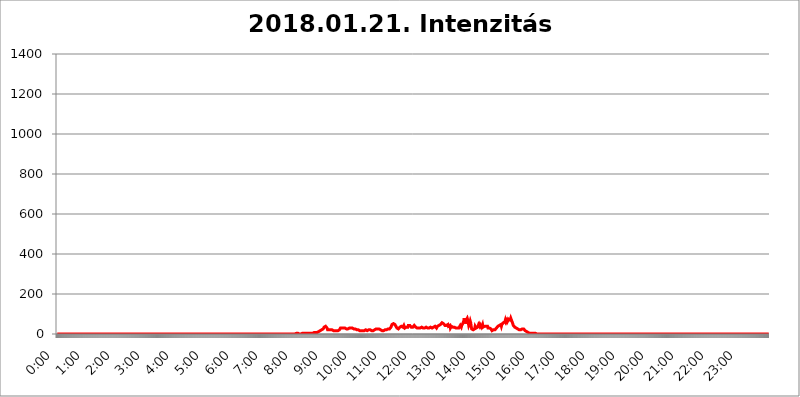
| Category | 2018.01.21. Intenzitás [W/m^2] |
|---|---|
| 0.0 | 0 |
| 0.0006944444444444445 | 0 |
| 0.001388888888888889 | 0 |
| 0.0020833333333333333 | 0 |
| 0.002777777777777778 | 0 |
| 0.003472222222222222 | 0 |
| 0.004166666666666667 | 0 |
| 0.004861111111111111 | 0 |
| 0.005555555555555556 | 0 |
| 0.0062499999999999995 | 0 |
| 0.006944444444444444 | 0 |
| 0.007638888888888889 | 0 |
| 0.008333333333333333 | 0 |
| 0.009027777777777779 | 0 |
| 0.009722222222222222 | 0 |
| 0.010416666666666666 | 0 |
| 0.011111111111111112 | 0 |
| 0.011805555555555555 | 0 |
| 0.012499999999999999 | 0 |
| 0.013194444444444444 | 0 |
| 0.013888888888888888 | 0 |
| 0.014583333333333332 | 0 |
| 0.015277777777777777 | 0 |
| 0.015972222222222224 | 0 |
| 0.016666666666666666 | 0 |
| 0.017361111111111112 | 0 |
| 0.018055555555555557 | 0 |
| 0.01875 | 0 |
| 0.019444444444444445 | 0 |
| 0.02013888888888889 | 0 |
| 0.020833333333333332 | 0 |
| 0.02152777777777778 | 0 |
| 0.022222222222222223 | 0 |
| 0.02291666666666667 | 0 |
| 0.02361111111111111 | 0 |
| 0.024305555555555556 | 0 |
| 0.024999999999999998 | 0 |
| 0.025694444444444447 | 0 |
| 0.02638888888888889 | 0 |
| 0.027083333333333334 | 0 |
| 0.027777777777777776 | 0 |
| 0.02847222222222222 | 0 |
| 0.029166666666666664 | 0 |
| 0.029861111111111113 | 0 |
| 0.030555555555555555 | 0 |
| 0.03125 | 0 |
| 0.03194444444444445 | 0 |
| 0.03263888888888889 | 0 |
| 0.03333333333333333 | 0 |
| 0.034027777777777775 | 0 |
| 0.034722222222222224 | 0 |
| 0.035416666666666666 | 0 |
| 0.036111111111111115 | 0 |
| 0.03680555555555556 | 0 |
| 0.0375 | 0 |
| 0.03819444444444444 | 0 |
| 0.03888888888888889 | 0 |
| 0.03958333333333333 | 0 |
| 0.04027777777777778 | 0 |
| 0.04097222222222222 | 0 |
| 0.041666666666666664 | 0 |
| 0.042361111111111106 | 0 |
| 0.04305555555555556 | 0 |
| 0.043750000000000004 | 0 |
| 0.044444444444444446 | 0 |
| 0.04513888888888889 | 0 |
| 0.04583333333333334 | 0 |
| 0.04652777777777778 | 0 |
| 0.04722222222222222 | 0 |
| 0.04791666666666666 | 0 |
| 0.04861111111111111 | 0 |
| 0.049305555555555554 | 0 |
| 0.049999999999999996 | 0 |
| 0.05069444444444445 | 0 |
| 0.051388888888888894 | 0 |
| 0.052083333333333336 | 0 |
| 0.05277777777777778 | 0 |
| 0.05347222222222222 | 0 |
| 0.05416666666666667 | 0 |
| 0.05486111111111111 | 0 |
| 0.05555555555555555 | 0 |
| 0.05625 | 0 |
| 0.05694444444444444 | 0 |
| 0.057638888888888885 | 0 |
| 0.05833333333333333 | 0 |
| 0.05902777777777778 | 0 |
| 0.059722222222222225 | 0 |
| 0.06041666666666667 | 0 |
| 0.061111111111111116 | 0 |
| 0.06180555555555556 | 0 |
| 0.0625 | 0 |
| 0.06319444444444444 | 0 |
| 0.06388888888888888 | 0 |
| 0.06458333333333334 | 0 |
| 0.06527777777777778 | 0 |
| 0.06597222222222222 | 0 |
| 0.06666666666666667 | 0 |
| 0.06736111111111111 | 0 |
| 0.06805555555555555 | 0 |
| 0.06874999999999999 | 0 |
| 0.06944444444444443 | 0 |
| 0.07013888888888889 | 0 |
| 0.07083333333333333 | 0 |
| 0.07152777777777779 | 0 |
| 0.07222222222222223 | 0 |
| 0.07291666666666667 | 0 |
| 0.07361111111111111 | 0 |
| 0.07430555555555556 | 0 |
| 0.075 | 0 |
| 0.07569444444444444 | 0 |
| 0.0763888888888889 | 0 |
| 0.07708333333333334 | 0 |
| 0.07777777777777778 | 0 |
| 0.07847222222222222 | 0 |
| 0.07916666666666666 | 0 |
| 0.0798611111111111 | 0 |
| 0.08055555555555556 | 0 |
| 0.08125 | 0 |
| 0.08194444444444444 | 0 |
| 0.08263888888888889 | 0 |
| 0.08333333333333333 | 0 |
| 0.08402777777777777 | 0 |
| 0.08472222222222221 | 0 |
| 0.08541666666666665 | 0 |
| 0.08611111111111112 | 0 |
| 0.08680555555555557 | 0 |
| 0.08750000000000001 | 0 |
| 0.08819444444444445 | 0 |
| 0.08888888888888889 | 0 |
| 0.08958333333333333 | 0 |
| 0.09027777777777778 | 0 |
| 0.09097222222222222 | 0 |
| 0.09166666666666667 | 0 |
| 0.09236111111111112 | 0 |
| 0.09305555555555556 | 0 |
| 0.09375 | 0 |
| 0.09444444444444444 | 0 |
| 0.09513888888888888 | 0 |
| 0.09583333333333333 | 0 |
| 0.09652777777777777 | 0 |
| 0.09722222222222222 | 0 |
| 0.09791666666666667 | 0 |
| 0.09861111111111111 | 0 |
| 0.09930555555555555 | 0 |
| 0.09999999999999999 | 0 |
| 0.10069444444444443 | 0 |
| 0.1013888888888889 | 0 |
| 0.10208333333333335 | 0 |
| 0.10277777777777779 | 0 |
| 0.10347222222222223 | 0 |
| 0.10416666666666667 | 0 |
| 0.10486111111111111 | 0 |
| 0.10555555555555556 | 0 |
| 0.10625 | 0 |
| 0.10694444444444444 | 0 |
| 0.1076388888888889 | 0 |
| 0.10833333333333334 | 0 |
| 0.10902777777777778 | 0 |
| 0.10972222222222222 | 0 |
| 0.1111111111111111 | 0 |
| 0.11180555555555556 | 0 |
| 0.11180555555555556 | 0 |
| 0.1125 | 0 |
| 0.11319444444444444 | 0 |
| 0.11388888888888889 | 0 |
| 0.11458333333333333 | 0 |
| 0.11527777777777777 | 0 |
| 0.11597222222222221 | 0 |
| 0.11666666666666665 | 0 |
| 0.1173611111111111 | 0 |
| 0.11805555555555557 | 0 |
| 0.11944444444444445 | 0 |
| 0.12013888888888889 | 0 |
| 0.12083333333333333 | 0 |
| 0.12152777777777778 | 0 |
| 0.12222222222222223 | 0 |
| 0.12291666666666667 | 0 |
| 0.12291666666666667 | 0 |
| 0.12361111111111112 | 0 |
| 0.12430555555555556 | 0 |
| 0.125 | 0 |
| 0.12569444444444444 | 0 |
| 0.12638888888888888 | 0 |
| 0.12708333333333333 | 0 |
| 0.16875 | 0 |
| 0.12847222222222224 | 0 |
| 0.12916666666666668 | 0 |
| 0.12986111111111112 | 0 |
| 0.13055555555555556 | 0 |
| 0.13125 | 0 |
| 0.13194444444444445 | 0 |
| 0.1326388888888889 | 0 |
| 0.13333333333333333 | 0 |
| 0.13402777777777777 | 0 |
| 0.13402777777777777 | 0 |
| 0.13472222222222222 | 0 |
| 0.13541666666666666 | 0 |
| 0.1361111111111111 | 0 |
| 0.13749999999999998 | 0 |
| 0.13819444444444443 | 0 |
| 0.1388888888888889 | 0 |
| 0.13958333333333334 | 0 |
| 0.14027777777777778 | 0 |
| 0.14097222222222222 | 0 |
| 0.14166666666666666 | 0 |
| 0.1423611111111111 | 0 |
| 0.14305555555555557 | 0 |
| 0.14375000000000002 | 0 |
| 0.14444444444444446 | 0 |
| 0.1451388888888889 | 0 |
| 0.1451388888888889 | 0 |
| 0.14652777777777778 | 0 |
| 0.14722222222222223 | 0 |
| 0.14791666666666667 | 0 |
| 0.1486111111111111 | 0 |
| 0.14930555555555555 | 0 |
| 0.15 | 0 |
| 0.15069444444444444 | 0 |
| 0.15138888888888888 | 0 |
| 0.15208333333333332 | 0 |
| 0.15277777777777776 | 0 |
| 0.15347222222222223 | 0 |
| 0.15416666666666667 | 0 |
| 0.15486111111111112 | 0 |
| 0.15555555555555556 | 0 |
| 0.15625 | 0 |
| 0.15694444444444444 | 0 |
| 0.15763888888888888 | 0 |
| 0.15833333333333333 | 0 |
| 0.15902777777777777 | 0 |
| 0.15972222222222224 | 0 |
| 0.16041666666666668 | 0 |
| 0.16111111111111112 | 0 |
| 0.16180555555555556 | 0 |
| 0.1625 | 0 |
| 0.16319444444444445 | 0 |
| 0.1638888888888889 | 0 |
| 0.16458333333333333 | 0 |
| 0.16527777777777777 | 0 |
| 0.16597222222222222 | 0 |
| 0.16666666666666666 | 0 |
| 0.1673611111111111 | 0 |
| 0.16805555555555554 | 0 |
| 0.16874999999999998 | 0 |
| 0.16944444444444443 | 0 |
| 0.17013888888888887 | 0 |
| 0.1708333333333333 | 0 |
| 0.17152777777777775 | 0 |
| 0.17222222222222225 | 0 |
| 0.1729166666666667 | 0 |
| 0.17361111111111113 | 0 |
| 0.17430555555555557 | 0 |
| 0.17500000000000002 | 0 |
| 0.17569444444444446 | 0 |
| 0.1763888888888889 | 0 |
| 0.17708333333333334 | 0 |
| 0.17777777777777778 | 0 |
| 0.17847222222222223 | 0 |
| 0.17916666666666667 | 0 |
| 0.1798611111111111 | 0 |
| 0.18055555555555555 | 0 |
| 0.18125 | 0 |
| 0.18194444444444444 | 0 |
| 0.1826388888888889 | 0 |
| 0.18333333333333335 | 0 |
| 0.1840277777777778 | 0 |
| 0.18472222222222223 | 0 |
| 0.18541666666666667 | 0 |
| 0.18611111111111112 | 0 |
| 0.18680555555555556 | 0 |
| 0.1875 | 0 |
| 0.18819444444444444 | 0 |
| 0.18888888888888888 | 0 |
| 0.18958333333333333 | 0 |
| 0.19027777777777777 | 0 |
| 0.1909722222222222 | 0 |
| 0.19166666666666665 | 0 |
| 0.19236111111111112 | 0 |
| 0.19305555555555554 | 0 |
| 0.19375 | 0 |
| 0.19444444444444445 | 0 |
| 0.1951388888888889 | 0 |
| 0.19583333333333333 | 0 |
| 0.19652777777777777 | 0 |
| 0.19722222222222222 | 0 |
| 0.19791666666666666 | 0 |
| 0.1986111111111111 | 0 |
| 0.19930555555555554 | 0 |
| 0.19999999999999998 | 0 |
| 0.20069444444444443 | 0 |
| 0.20138888888888887 | 0 |
| 0.2020833333333333 | 0 |
| 0.2027777777777778 | 0 |
| 0.2034722222222222 | 0 |
| 0.2041666666666667 | 0 |
| 0.20486111111111113 | 0 |
| 0.20555555555555557 | 0 |
| 0.20625000000000002 | 0 |
| 0.20694444444444446 | 0 |
| 0.2076388888888889 | 0 |
| 0.20833333333333334 | 0 |
| 0.20902777777777778 | 0 |
| 0.20972222222222223 | 0 |
| 0.21041666666666667 | 0 |
| 0.2111111111111111 | 0 |
| 0.21180555555555555 | 0 |
| 0.2125 | 0 |
| 0.21319444444444444 | 0 |
| 0.2138888888888889 | 0 |
| 0.21458333333333335 | 0 |
| 0.2152777777777778 | 0 |
| 0.21597222222222223 | 0 |
| 0.21666666666666667 | 0 |
| 0.21736111111111112 | 0 |
| 0.21805555555555556 | 0 |
| 0.21875 | 0 |
| 0.21944444444444444 | 0 |
| 0.22013888888888888 | 0 |
| 0.22083333333333333 | 0 |
| 0.22152777777777777 | 0 |
| 0.2222222222222222 | 0 |
| 0.22291666666666665 | 0 |
| 0.2236111111111111 | 0 |
| 0.22430555555555556 | 0 |
| 0.225 | 0 |
| 0.22569444444444445 | 0 |
| 0.2263888888888889 | 0 |
| 0.22708333333333333 | 0 |
| 0.22777777777777777 | 0 |
| 0.22847222222222222 | 0 |
| 0.22916666666666666 | 0 |
| 0.2298611111111111 | 0 |
| 0.23055555555555554 | 0 |
| 0.23124999999999998 | 0 |
| 0.23194444444444443 | 0 |
| 0.23263888888888887 | 0 |
| 0.2333333333333333 | 0 |
| 0.2340277777777778 | 0 |
| 0.2347222222222222 | 0 |
| 0.2354166666666667 | 0 |
| 0.23611111111111113 | 0 |
| 0.23680555555555557 | 0 |
| 0.23750000000000002 | 0 |
| 0.23819444444444446 | 0 |
| 0.2388888888888889 | 0 |
| 0.23958333333333334 | 0 |
| 0.24027777777777778 | 0 |
| 0.24097222222222223 | 0 |
| 0.24166666666666667 | 0 |
| 0.2423611111111111 | 0 |
| 0.24305555555555555 | 0 |
| 0.24375 | 0 |
| 0.24444444444444446 | 0 |
| 0.24513888888888888 | 0 |
| 0.24583333333333335 | 0 |
| 0.2465277777777778 | 0 |
| 0.24722222222222223 | 0 |
| 0.24791666666666667 | 0 |
| 0.24861111111111112 | 0 |
| 0.24930555555555556 | 0 |
| 0.25 | 0 |
| 0.25069444444444444 | 0 |
| 0.2513888888888889 | 0 |
| 0.2520833333333333 | 0 |
| 0.25277777777777777 | 0 |
| 0.2534722222222222 | 0 |
| 0.25416666666666665 | 0 |
| 0.2548611111111111 | 0 |
| 0.2555555555555556 | 0 |
| 0.25625000000000003 | 0 |
| 0.2569444444444445 | 0 |
| 0.2576388888888889 | 0 |
| 0.25833333333333336 | 0 |
| 0.2590277777777778 | 0 |
| 0.25972222222222224 | 0 |
| 0.2604166666666667 | 0 |
| 0.2611111111111111 | 0 |
| 0.26180555555555557 | 0 |
| 0.2625 | 0 |
| 0.26319444444444445 | 0 |
| 0.2638888888888889 | 0 |
| 0.26458333333333334 | 0 |
| 0.2652777777777778 | 0 |
| 0.2659722222222222 | 0 |
| 0.26666666666666666 | 0 |
| 0.2673611111111111 | 0 |
| 0.26805555555555555 | 0 |
| 0.26875 | 0 |
| 0.26944444444444443 | 0 |
| 0.2701388888888889 | 0 |
| 0.2708333333333333 | 0 |
| 0.27152777777777776 | 0 |
| 0.2722222222222222 | 0 |
| 0.27291666666666664 | 0 |
| 0.2736111111111111 | 0 |
| 0.2743055555555555 | 0 |
| 0.27499999999999997 | 0 |
| 0.27569444444444446 | 0 |
| 0.27638888888888885 | 0 |
| 0.27708333333333335 | 0 |
| 0.2777777777777778 | 0 |
| 0.27847222222222223 | 0 |
| 0.2791666666666667 | 0 |
| 0.2798611111111111 | 0 |
| 0.28055555555555556 | 0 |
| 0.28125 | 0 |
| 0.28194444444444444 | 0 |
| 0.2826388888888889 | 0 |
| 0.2833333333333333 | 0 |
| 0.28402777777777777 | 0 |
| 0.2847222222222222 | 0 |
| 0.28541666666666665 | 0 |
| 0.28611111111111115 | 0 |
| 0.28680555555555554 | 0 |
| 0.28750000000000003 | 0 |
| 0.2881944444444445 | 0 |
| 0.2888888888888889 | 0 |
| 0.28958333333333336 | 0 |
| 0.2902777777777778 | 0 |
| 0.29097222222222224 | 0 |
| 0.2916666666666667 | 0 |
| 0.2923611111111111 | 0 |
| 0.29305555555555557 | 0 |
| 0.29375 | 0 |
| 0.29444444444444445 | 0 |
| 0.2951388888888889 | 0 |
| 0.29583333333333334 | 0 |
| 0.2965277777777778 | 0 |
| 0.2972222222222222 | 0 |
| 0.29791666666666666 | 0 |
| 0.2986111111111111 | 0 |
| 0.29930555555555555 | 0 |
| 0.3 | 0 |
| 0.30069444444444443 | 0 |
| 0.3013888888888889 | 0 |
| 0.3020833333333333 | 0 |
| 0.30277777777777776 | 0 |
| 0.3034722222222222 | 0 |
| 0.30416666666666664 | 0 |
| 0.3048611111111111 | 0 |
| 0.3055555555555555 | 0 |
| 0.30624999999999997 | 0 |
| 0.3069444444444444 | 0 |
| 0.3076388888888889 | 0 |
| 0.30833333333333335 | 0 |
| 0.3090277777777778 | 0 |
| 0.30972222222222223 | 0 |
| 0.3104166666666667 | 0 |
| 0.3111111111111111 | 0 |
| 0.31180555555555556 | 0 |
| 0.3125 | 0 |
| 0.31319444444444444 | 0 |
| 0.3138888888888889 | 0 |
| 0.3145833333333333 | 0 |
| 0.31527777777777777 | 0 |
| 0.3159722222222222 | 0 |
| 0.31666666666666665 | 0 |
| 0.31736111111111115 | 0 |
| 0.31805555555555554 | 0 |
| 0.31875000000000003 | 0 |
| 0.3194444444444445 | 0 |
| 0.3201388888888889 | 0 |
| 0.32083333333333336 | 0 |
| 0.3215277777777778 | 0 |
| 0.32222222222222224 | 0 |
| 0.3229166666666667 | 0 |
| 0.3236111111111111 | 0 |
| 0.32430555555555557 | 0 |
| 0.325 | 0 |
| 0.32569444444444445 | 0 |
| 0.3263888888888889 | 0 |
| 0.32708333333333334 | 0 |
| 0.3277777777777778 | 0 |
| 0.3284722222222222 | 0 |
| 0.32916666666666666 | 0 |
| 0.3298611111111111 | 0 |
| 0.33055555555555555 | 0 |
| 0.33125 | 0 |
| 0.33194444444444443 | 0 |
| 0.3326388888888889 | 3.525 |
| 0.3333333333333333 | 0 |
| 0.3340277777777778 | 0 |
| 0.3347222222222222 | 0 |
| 0.3354166666666667 | 3.525 |
| 0.3361111111111111 | 3.525 |
| 0.3368055555555556 | 3.525 |
| 0.33749999999999997 | 3.525 |
| 0.33819444444444446 | 3.525 |
| 0.33888888888888885 | 3.525 |
| 0.33958333333333335 | 0 |
| 0.34027777777777773 | 3.525 |
| 0.34097222222222223 | 3.525 |
| 0.3416666666666666 | 0 |
| 0.3423611111111111 | 3.525 |
| 0.3430555555555555 | 3.525 |
| 0.34375 | 3.525 |
| 0.3444444444444445 | 3.525 |
| 0.3451388888888889 | 3.525 |
| 0.3458333333333334 | 3.525 |
| 0.34652777777777777 | 3.525 |
| 0.34722222222222227 | 3.525 |
| 0.34791666666666665 | 3.525 |
| 0.34861111111111115 | 3.525 |
| 0.34930555555555554 | 3.525 |
| 0.35000000000000003 | 3.525 |
| 0.3506944444444444 | 3.525 |
| 0.3513888888888889 | 3.525 |
| 0.3520833333333333 | 3.525 |
| 0.3527777777777778 | 3.525 |
| 0.3534722222222222 | 3.525 |
| 0.3541666666666667 | 3.525 |
| 0.3548611111111111 | 3.525 |
| 0.35555555555555557 | 3.525 |
| 0.35625 | 3.525 |
| 0.35694444444444445 | 3.525 |
| 0.3576388888888889 | 3.525 |
| 0.35833333333333334 | 3.525 |
| 0.3590277777777778 | 3.525 |
| 0.3597222222222222 | 3.525 |
| 0.36041666666666666 | 7.887 |
| 0.3611111111111111 | 3.525 |
| 0.36180555555555555 | 3.525 |
| 0.3625 | 7.887 |
| 0.36319444444444443 | 7.887 |
| 0.3638888888888889 | 7.887 |
| 0.3645833333333333 | 7.887 |
| 0.3652777777777778 | 7.887 |
| 0.3659722222222222 | 12.257 |
| 0.3666666666666667 | 12.257 |
| 0.3673611111111111 | 12.257 |
| 0.3680555555555556 | 12.257 |
| 0.36874999999999997 | 16.636 |
| 0.36944444444444446 | 16.636 |
| 0.37013888888888885 | 21.024 |
| 0.37083333333333335 | 21.024 |
| 0.37152777777777773 | 21.024 |
| 0.37222222222222223 | 25.419 |
| 0.3729166666666666 | 25.419 |
| 0.3736111111111111 | 29.823 |
| 0.3743055555555555 | 34.234 |
| 0.375 | 34.234 |
| 0.3756944444444445 | 38.653 |
| 0.3763888888888889 | 38.653 |
| 0.3770833333333334 | 38.653 |
| 0.37777777777777777 | 34.234 |
| 0.37847222222222227 | 29.823 |
| 0.37916666666666665 | 21.024 |
| 0.37986111111111115 | 21.024 |
| 0.38055555555555554 | 21.024 |
| 0.38125000000000003 | 21.024 |
| 0.3819444444444444 | 21.024 |
| 0.3826388888888889 | 21.024 |
| 0.3833333333333333 | 21.024 |
| 0.3840277777777778 | 25.419 |
| 0.3847222222222222 | 21.024 |
| 0.3854166666666667 | 21.024 |
| 0.3861111111111111 | 21.024 |
| 0.38680555555555557 | 21.024 |
| 0.3875 | 16.636 |
| 0.38819444444444445 | 16.636 |
| 0.3888888888888889 | 16.636 |
| 0.38958333333333334 | 16.636 |
| 0.3902777777777778 | 16.636 |
| 0.3909722222222222 | 16.636 |
| 0.39166666666666666 | 16.636 |
| 0.3923611111111111 | 16.636 |
| 0.39305555555555555 | 16.636 |
| 0.39375 | 16.636 |
| 0.39444444444444443 | 16.636 |
| 0.3951388888888889 | 21.024 |
| 0.3958333333333333 | 21.024 |
| 0.3965277777777778 | 25.419 |
| 0.3972222222222222 | 29.823 |
| 0.3979166666666667 | 29.823 |
| 0.3986111111111111 | 29.823 |
| 0.3993055555555556 | 29.823 |
| 0.39999999999999997 | 34.234 |
| 0.40069444444444446 | 29.823 |
| 0.40138888888888885 | 29.823 |
| 0.40208333333333335 | 29.823 |
| 0.40277777777777773 | 29.823 |
| 0.40347222222222223 | 29.823 |
| 0.4041666666666666 | 25.419 |
| 0.4048611111111111 | 25.419 |
| 0.4055555555555555 | 25.419 |
| 0.40625 | 25.419 |
| 0.4069444444444445 | 21.024 |
| 0.4076388888888889 | 25.419 |
| 0.4083333333333334 | 25.419 |
| 0.40902777777777777 | 29.823 |
| 0.40972222222222227 | 29.823 |
| 0.41041666666666665 | 29.823 |
| 0.41111111111111115 | 29.823 |
| 0.41180555555555554 | 29.823 |
| 0.41250000000000003 | 29.823 |
| 0.4131944444444444 | 29.823 |
| 0.4138888888888889 | 29.823 |
| 0.4145833333333333 | 29.823 |
| 0.4152777777777778 | 25.419 |
| 0.4159722222222222 | 25.419 |
| 0.4166666666666667 | 25.419 |
| 0.4173611111111111 | 25.419 |
| 0.41805555555555557 | 25.419 |
| 0.41875 | 25.419 |
| 0.41944444444444445 | 21.024 |
| 0.4201388888888889 | 21.024 |
| 0.42083333333333334 | 21.024 |
| 0.4215277777777778 | 21.024 |
| 0.4222222222222222 | 21.024 |
| 0.42291666666666666 | 21.024 |
| 0.4236111111111111 | 21.024 |
| 0.42430555555555555 | 16.636 |
| 0.425 | 16.636 |
| 0.42569444444444443 | 16.636 |
| 0.4263888888888889 | 16.636 |
| 0.4270833333333333 | 16.636 |
| 0.4277777777777778 | 16.636 |
| 0.4284722222222222 | 16.636 |
| 0.4291666666666667 | 16.636 |
| 0.4298611111111111 | 16.636 |
| 0.4305555555555556 | 16.636 |
| 0.43124999999999997 | 16.636 |
| 0.43194444444444446 | 16.636 |
| 0.43263888888888885 | 21.024 |
| 0.43333333333333335 | 21.024 |
| 0.43402777777777773 | 21.024 |
| 0.43472222222222223 | 16.636 |
| 0.4354166666666666 | 21.024 |
| 0.4361111111111111 | 21.024 |
| 0.4368055555555555 | 21.024 |
| 0.4375 | 21.024 |
| 0.4381944444444445 | 21.024 |
| 0.4388888888888889 | 21.024 |
| 0.4395833333333334 | 16.636 |
| 0.44027777777777777 | 16.636 |
| 0.44097222222222227 | 16.636 |
| 0.44166666666666665 | 16.636 |
| 0.44236111111111115 | 16.636 |
| 0.44305555555555554 | 16.636 |
| 0.44375000000000003 | 16.636 |
| 0.4444444444444444 | 21.024 |
| 0.4451388888888889 | 21.024 |
| 0.4458333333333333 | 21.024 |
| 0.4465277777777778 | 21.024 |
| 0.4472222222222222 | 25.419 |
| 0.4479166666666667 | 25.419 |
| 0.4486111111111111 | 25.419 |
| 0.44930555555555557 | 25.419 |
| 0.45 | 29.823 |
| 0.45069444444444445 | 25.419 |
| 0.4513888888888889 | 25.419 |
| 0.45208333333333334 | 25.419 |
| 0.4527777777777778 | 21.024 |
| 0.4534722222222222 | 21.024 |
| 0.45416666666666666 | 21.024 |
| 0.4548611111111111 | 21.024 |
| 0.45555555555555555 | 16.636 |
| 0.45625 | 16.636 |
| 0.45694444444444443 | 16.636 |
| 0.4576388888888889 | 16.636 |
| 0.4583333333333333 | 21.024 |
| 0.4590277777777778 | 21.024 |
| 0.4597222222222222 | 21.024 |
| 0.4604166666666667 | 21.024 |
| 0.4611111111111111 | 21.024 |
| 0.4618055555555556 | 21.024 |
| 0.46249999999999997 | 21.024 |
| 0.46319444444444446 | 21.024 |
| 0.46388888888888885 | 25.419 |
| 0.46458333333333335 | 25.419 |
| 0.46527777777777773 | 25.419 |
| 0.46597222222222223 | 25.419 |
| 0.4666666666666666 | 29.823 |
| 0.4673611111111111 | 29.823 |
| 0.4680555555555555 | 34.234 |
| 0.46875 | 38.653 |
| 0.4694444444444445 | 47.511 |
| 0.4701388888888889 | 47.511 |
| 0.4708333333333334 | 47.511 |
| 0.47152777777777777 | 51.951 |
| 0.47222222222222227 | 51.951 |
| 0.47291666666666665 | 51.951 |
| 0.47361111111111115 | 47.511 |
| 0.47430555555555554 | 43.079 |
| 0.47500000000000003 | 38.653 |
| 0.4756944444444444 | 34.234 |
| 0.4763888888888889 | 29.823 |
| 0.4770833333333333 | 25.419 |
| 0.4777777777777778 | 25.419 |
| 0.4784722222222222 | 25.419 |
| 0.4791666666666667 | 25.419 |
| 0.4798611111111111 | 29.823 |
| 0.48055555555555557 | 34.234 |
| 0.48125 | 38.653 |
| 0.48194444444444445 | 38.653 |
| 0.4826388888888889 | 38.653 |
| 0.48333333333333334 | 38.653 |
| 0.4840277777777778 | 34.234 |
| 0.4847222222222222 | 34.234 |
| 0.48541666666666666 | 38.653 |
| 0.4861111111111111 | 43.079 |
| 0.48680555555555555 | 38.653 |
| 0.4875 | 29.823 |
| 0.48819444444444443 | 29.823 |
| 0.4888888888888889 | 29.823 |
| 0.4895833333333333 | 34.234 |
| 0.4902777777777778 | 34.234 |
| 0.4909722222222222 | 34.234 |
| 0.4916666666666667 | 34.234 |
| 0.4923611111111111 | 43.079 |
| 0.4930555555555556 | 43.079 |
| 0.49374999999999997 | 43.079 |
| 0.49444444444444446 | 43.079 |
| 0.49513888888888885 | 38.653 |
| 0.49583333333333335 | 38.653 |
| 0.49652777777777773 | 34.234 |
| 0.49722222222222223 | 34.234 |
| 0.4979166666666666 | 34.234 |
| 0.4986111111111111 | 34.234 |
| 0.4993055555555555 | 38.653 |
| 0.5 | 38.653 |
| 0.5006944444444444 | 43.079 |
| 0.5013888888888889 | 43.079 |
| 0.5020833333333333 | 43.079 |
| 0.5027777777777778 | 34.234 |
| 0.5034722222222222 | 29.823 |
| 0.5041666666666667 | 29.823 |
| 0.5048611111111111 | 29.823 |
| 0.5055555555555555 | 29.823 |
| 0.50625 | 29.823 |
| 0.5069444444444444 | 29.823 |
| 0.5076388888888889 | 25.419 |
| 0.5083333333333333 | 25.419 |
| 0.5090277777777777 | 29.823 |
| 0.5097222222222222 | 29.823 |
| 0.5104166666666666 | 34.234 |
| 0.5111111111111112 | 34.234 |
| 0.5118055555555555 | 34.234 |
| 0.5125000000000001 | 29.823 |
| 0.5131944444444444 | 29.823 |
| 0.513888888888889 | 29.823 |
| 0.5145833333333333 | 29.823 |
| 0.5152777777777778 | 29.823 |
| 0.5159722222222222 | 34.234 |
| 0.5166666666666667 | 34.234 |
| 0.517361111111111 | 34.234 |
| 0.5180555555555556 | 34.234 |
| 0.5187499999999999 | 29.823 |
| 0.5194444444444445 | 29.823 |
| 0.5201388888888888 | 29.823 |
| 0.5208333333333334 | 29.823 |
| 0.5215277777777778 | 29.823 |
| 0.5222222222222223 | 29.823 |
| 0.5229166666666667 | 29.823 |
| 0.5236111111111111 | 34.234 |
| 0.5243055555555556 | 34.234 |
| 0.525 | 34.234 |
| 0.5256944444444445 | 29.823 |
| 0.5263888888888889 | 29.823 |
| 0.5270833333333333 | 29.823 |
| 0.5277777777777778 | 34.234 |
| 0.5284722222222222 | 38.653 |
| 0.5291666666666667 | 34.234 |
| 0.5298611111111111 | 38.653 |
| 0.5305555555555556 | 34.234 |
| 0.53125 | 34.234 |
| 0.5319444444444444 | 29.823 |
| 0.5326388888888889 | 29.823 |
| 0.5333333333333333 | 38.653 |
| 0.5340277777777778 | 43.079 |
| 0.5347222222222222 | 38.653 |
| 0.5354166666666667 | 43.079 |
| 0.5361111111111111 | 43.079 |
| 0.5368055555555555 | 47.511 |
| 0.5375 | 47.511 |
| 0.5381944444444444 | 47.511 |
| 0.5388888888888889 | 51.951 |
| 0.5395833333333333 | 56.398 |
| 0.5402777777777777 | 56.398 |
| 0.5409722222222222 | 56.398 |
| 0.5416666666666666 | 51.951 |
| 0.5423611111111112 | 51.951 |
| 0.5430555555555555 | 47.511 |
| 0.5437500000000001 | 43.079 |
| 0.5444444444444444 | 43.079 |
| 0.545138888888889 | 47.511 |
| 0.5458333333333333 | 43.079 |
| 0.5465277777777778 | 47.511 |
| 0.5472222222222222 | 47.511 |
| 0.5479166666666667 | 47.511 |
| 0.548611111111111 | 38.653 |
| 0.5493055555555556 | 34.234 |
| 0.5499999999999999 | 43.079 |
| 0.5506944444444445 | 43.079 |
| 0.5513888888888888 | 29.823 |
| 0.5520833333333334 | 34.234 |
| 0.5527777777777778 | 38.653 |
| 0.5534722222222223 | 43.079 |
| 0.5541666666666667 | 38.653 |
| 0.5548611111111111 | 34.234 |
| 0.5555555555555556 | 38.653 |
| 0.55625 | 29.823 |
| 0.5569444444444445 | 34.234 |
| 0.5576388888888889 | 34.234 |
| 0.5583333333333333 | 29.823 |
| 0.5590277777777778 | 29.823 |
| 0.5597222222222222 | 25.419 |
| 0.5604166666666667 | 29.823 |
| 0.5611111111111111 | 29.823 |
| 0.5618055555555556 | 34.234 |
| 0.5625 | 29.823 |
| 0.5631944444444444 | 29.823 |
| 0.5638888888888889 | 25.419 |
| 0.5645833333333333 | 25.419 |
| 0.5652777777777778 | 43.079 |
| 0.5659722222222222 | 43.079 |
| 0.5666666666666667 | 34.234 |
| 0.5673611111111111 | 43.079 |
| 0.5680555555555555 | 47.511 |
| 0.56875 | 51.951 |
| 0.5694444444444444 | 47.511 |
| 0.5701388888888889 | 65.31 |
| 0.5708333333333333 | 78.722 |
| 0.5715277777777777 | 65.31 |
| 0.5722222222222222 | 51.951 |
| 0.5729166666666666 | 60.85 |
| 0.5736111111111112 | 69.775 |
| 0.5743055555555555 | 74.246 |
| 0.5750000000000001 | 78.722 |
| 0.5756944444444444 | 69.775 |
| 0.576388888888889 | 56.398 |
| 0.5770833333333333 | 43.079 |
| 0.5777777777777778 | 47.511 |
| 0.5784722222222222 | 56.398 |
| 0.5791666666666667 | 65.31 |
| 0.579861111111111 | 56.398 |
| 0.5805555555555556 | 38.653 |
| 0.5812499999999999 | 25.419 |
| 0.5819444444444445 | 21.024 |
| 0.5826388888888888 | 21.024 |
| 0.5833333333333334 | 21.024 |
| 0.5840277777777778 | 25.419 |
| 0.5847222222222223 | 25.419 |
| 0.5854166666666667 | 25.419 |
| 0.5861111111111111 | 38.653 |
| 0.5868055555555556 | 38.653 |
| 0.5875 | 29.823 |
| 0.5881944444444445 | 29.823 |
| 0.5888888888888889 | 34.234 |
| 0.5895833333333333 | 34.234 |
| 0.5902777777777778 | 38.653 |
| 0.5909722222222222 | 47.511 |
| 0.5916666666666667 | 47.511 |
| 0.5923611111111111 | 38.653 |
| 0.5930555555555556 | 47.511 |
| 0.59375 | 43.079 |
| 0.5944444444444444 | 47.511 |
| 0.5951388888888889 | 34.234 |
| 0.5958333333333333 | 38.653 |
| 0.5965277777777778 | 47.511 |
| 0.5972222222222222 | 34.234 |
| 0.5979166666666667 | 29.823 |
| 0.5986111111111111 | 29.823 |
| 0.5993055555555555 | 38.653 |
| 0.6 | 38.653 |
| 0.6006944444444444 | 38.653 |
| 0.6013888888888889 | 38.653 |
| 0.6020833333333333 | 38.653 |
| 0.6027777777777777 | 38.653 |
| 0.6034722222222222 | 38.653 |
| 0.6041666666666666 | 29.823 |
| 0.6048611111111112 | 29.823 |
| 0.6055555555555555 | 29.823 |
| 0.6062500000000001 | 29.823 |
| 0.6069444444444444 | 29.823 |
| 0.607638888888889 | 25.419 |
| 0.6083333333333333 | 25.419 |
| 0.6090277777777778 | 25.419 |
| 0.6097222222222222 | 16.636 |
| 0.6104166666666667 | 16.636 |
| 0.611111111111111 | 21.024 |
| 0.6118055555555556 | 21.024 |
| 0.6124999999999999 | 21.024 |
| 0.6131944444444445 | 21.024 |
| 0.6138888888888888 | 21.024 |
| 0.6145833333333334 | 21.024 |
| 0.6152777777777778 | 21.024 |
| 0.6159722222222223 | 29.823 |
| 0.6166666666666667 | 29.823 |
| 0.6173611111111111 | 29.823 |
| 0.6180555555555556 | 38.653 |
| 0.61875 | 43.079 |
| 0.6194444444444445 | 38.653 |
| 0.6201388888888889 | 43.079 |
| 0.6208333333333333 | 43.079 |
| 0.6215277777777778 | 43.079 |
| 0.6222222222222222 | 47.511 |
| 0.6229166666666667 | 38.653 |
| 0.6236111111111111 | 47.511 |
| 0.6243055555555556 | 47.511 |
| 0.625 | 51.951 |
| 0.6256944444444444 | 56.398 |
| 0.6263888888888889 | 56.398 |
| 0.6270833333333333 | 56.398 |
| 0.6277777777777778 | 60.85 |
| 0.6284722222222222 | 69.775 |
| 0.6291666666666667 | 60.85 |
| 0.6298611111111111 | 60.85 |
| 0.6305555555555555 | 69.775 |
| 0.63125 | 60.85 |
| 0.6319444444444444 | 65.31 |
| 0.6326388888888889 | 65.31 |
| 0.6333333333333333 | 74.246 |
| 0.6340277777777777 | 74.246 |
| 0.6347222222222222 | 69.775 |
| 0.6354166666666666 | 69.775 |
| 0.6361111111111112 | 78.722 |
| 0.6368055555555555 | 74.246 |
| 0.6375000000000001 | 65.31 |
| 0.6381944444444444 | 60.85 |
| 0.638888888888889 | 51.951 |
| 0.6395833333333333 | 43.079 |
| 0.6402777777777778 | 38.653 |
| 0.6409722222222222 | 38.653 |
| 0.6416666666666667 | 34.234 |
| 0.642361111111111 | 29.823 |
| 0.6430555555555556 | 29.823 |
| 0.6437499999999999 | 29.823 |
| 0.6444444444444445 | 29.823 |
| 0.6451388888888888 | 29.823 |
| 0.6458333333333334 | 25.419 |
| 0.6465277777777778 | 25.419 |
| 0.6472222222222223 | 25.419 |
| 0.6479166666666667 | 21.024 |
| 0.6486111111111111 | 21.024 |
| 0.6493055555555556 | 21.024 |
| 0.65 | 21.024 |
| 0.6506944444444445 | 21.024 |
| 0.6513888888888889 | 21.024 |
| 0.6520833333333333 | 25.419 |
| 0.6527777777777778 | 29.823 |
| 0.6534722222222222 | 25.419 |
| 0.6541666666666667 | 25.419 |
| 0.6548611111111111 | 21.024 |
| 0.6555555555555556 | 21.024 |
| 0.65625 | 16.636 |
| 0.6569444444444444 | 16.636 |
| 0.6576388888888889 | 12.257 |
| 0.6583333333333333 | 12.257 |
| 0.6590277777777778 | 12.257 |
| 0.6597222222222222 | 7.887 |
| 0.6604166666666667 | 7.887 |
| 0.6611111111111111 | 7.887 |
| 0.6618055555555555 | 7.887 |
| 0.6625 | 3.525 |
| 0.6631944444444444 | 7.887 |
| 0.6638888888888889 | 7.887 |
| 0.6645833333333333 | 3.525 |
| 0.6652777777777777 | 3.525 |
| 0.6659722222222222 | 3.525 |
| 0.6666666666666666 | 3.525 |
| 0.6673611111111111 | 3.525 |
| 0.6680555555555556 | 3.525 |
| 0.6687500000000001 | 3.525 |
| 0.6694444444444444 | 3.525 |
| 0.6701388888888888 | 3.525 |
| 0.6708333333333334 | 3.525 |
| 0.6715277777777778 | 0 |
| 0.6722222222222222 | 3.525 |
| 0.6729166666666666 | 0 |
| 0.6736111111111112 | 0 |
| 0.6743055555555556 | 0 |
| 0.6749999999999999 | 0 |
| 0.6756944444444444 | 0 |
| 0.6763888888888889 | 0 |
| 0.6770833333333334 | 0 |
| 0.6777777777777777 | 0 |
| 0.6784722222222223 | 0 |
| 0.6791666666666667 | 0 |
| 0.6798611111111111 | 0 |
| 0.6805555555555555 | 0 |
| 0.68125 | 0 |
| 0.6819444444444445 | 0 |
| 0.6826388888888889 | 0 |
| 0.6833333333333332 | 0 |
| 0.6840277777777778 | 0 |
| 0.6847222222222222 | 0 |
| 0.6854166666666667 | 0 |
| 0.686111111111111 | 0 |
| 0.6868055555555556 | 0 |
| 0.6875 | 0 |
| 0.6881944444444444 | 0 |
| 0.688888888888889 | 0 |
| 0.6895833333333333 | 0 |
| 0.6902777777777778 | 0 |
| 0.6909722222222222 | 0 |
| 0.6916666666666668 | 0 |
| 0.6923611111111111 | 0 |
| 0.6930555555555555 | 0 |
| 0.69375 | 0 |
| 0.6944444444444445 | 0 |
| 0.6951388888888889 | 0 |
| 0.6958333333333333 | 0 |
| 0.6965277777777777 | 0 |
| 0.6972222222222223 | 0 |
| 0.6979166666666666 | 0 |
| 0.6986111111111111 | 0 |
| 0.6993055555555556 | 0 |
| 0.7000000000000001 | 0 |
| 0.7006944444444444 | 0 |
| 0.7013888888888888 | 0 |
| 0.7020833333333334 | 0 |
| 0.7027777777777778 | 0 |
| 0.7034722222222222 | 0 |
| 0.7041666666666666 | 0 |
| 0.7048611111111112 | 0 |
| 0.7055555555555556 | 0 |
| 0.7062499999999999 | 0 |
| 0.7069444444444444 | 0 |
| 0.7076388888888889 | 0 |
| 0.7083333333333334 | 0 |
| 0.7090277777777777 | 0 |
| 0.7097222222222223 | 0 |
| 0.7104166666666667 | 0 |
| 0.7111111111111111 | 0 |
| 0.7118055555555555 | 0 |
| 0.7125 | 0 |
| 0.7131944444444445 | 0 |
| 0.7138888888888889 | 0 |
| 0.7145833333333332 | 0 |
| 0.7152777777777778 | 0 |
| 0.7159722222222222 | 0 |
| 0.7166666666666667 | 0 |
| 0.717361111111111 | 0 |
| 0.7180555555555556 | 0 |
| 0.71875 | 0 |
| 0.7194444444444444 | 0 |
| 0.720138888888889 | 0 |
| 0.7208333333333333 | 0 |
| 0.7215277777777778 | 0 |
| 0.7222222222222222 | 0 |
| 0.7229166666666668 | 0 |
| 0.7236111111111111 | 0 |
| 0.7243055555555555 | 0 |
| 0.725 | 0 |
| 0.7256944444444445 | 0 |
| 0.7263888888888889 | 0 |
| 0.7270833333333333 | 0 |
| 0.7277777777777777 | 0 |
| 0.7284722222222223 | 0 |
| 0.7291666666666666 | 0 |
| 0.7298611111111111 | 0 |
| 0.7305555555555556 | 0 |
| 0.7312500000000001 | 0 |
| 0.7319444444444444 | 0 |
| 0.7326388888888888 | 0 |
| 0.7333333333333334 | 0 |
| 0.7340277777777778 | 0 |
| 0.7347222222222222 | 0 |
| 0.7354166666666666 | 0 |
| 0.7361111111111112 | 0 |
| 0.7368055555555556 | 0 |
| 0.7374999999999999 | 0 |
| 0.7381944444444444 | 0 |
| 0.7388888888888889 | 0 |
| 0.7395833333333334 | 0 |
| 0.7402777777777777 | 0 |
| 0.7409722222222223 | 0 |
| 0.7416666666666667 | 0 |
| 0.7423611111111111 | 0 |
| 0.7430555555555555 | 0 |
| 0.74375 | 0 |
| 0.7444444444444445 | 0 |
| 0.7451388888888889 | 0 |
| 0.7458333333333332 | 0 |
| 0.7465277777777778 | 0 |
| 0.7472222222222222 | 0 |
| 0.7479166666666667 | 0 |
| 0.748611111111111 | 0 |
| 0.7493055555555556 | 0 |
| 0.75 | 0 |
| 0.7506944444444444 | 0 |
| 0.751388888888889 | 0 |
| 0.7520833333333333 | 0 |
| 0.7527777777777778 | 0 |
| 0.7534722222222222 | 0 |
| 0.7541666666666668 | 0 |
| 0.7548611111111111 | 0 |
| 0.7555555555555555 | 0 |
| 0.75625 | 0 |
| 0.7569444444444445 | 0 |
| 0.7576388888888889 | 0 |
| 0.7583333333333333 | 0 |
| 0.7590277777777777 | 0 |
| 0.7597222222222223 | 0 |
| 0.7604166666666666 | 0 |
| 0.7611111111111111 | 0 |
| 0.7618055555555556 | 0 |
| 0.7625000000000001 | 0 |
| 0.7631944444444444 | 0 |
| 0.7638888888888888 | 0 |
| 0.7645833333333334 | 0 |
| 0.7652777777777778 | 0 |
| 0.7659722222222222 | 0 |
| 0.7666666666666666 | 0 |
| 0.7673611111111112 | 0 |
| 0.7680555555555556 | 0 |
| 0.7687499999999999 | 0 |
| 0.7694444444444444 | 0 |
| 0.7701388888888889 | 0 |
| 0.7708333333333334 | 0 |
| 0.7715277777777777 | 0 |
| 0.7722222222222223 | 0 |
| 0.7729166666666667 | 0 |
| 0.7736111111111111 | 0 |
| 0.7743055555555555 | 0 |
| 0.775 | 0 |
| 0.7756944444444445 | 0 |
| 0.7763888888888889 | 0 |
| 0.7770833333333332 | 0 |
| 0.7777777777777778 | 0 |
| 0.7784722222222222 | 0 |
| 0.7791666666666667 | 0 |
| 0.779861111111111 | 0 |
| 0.7805555555555556 | 0 |
| 0.78125 | 0 |
| 0.7819444444444444 | 0 |
| 0.782638888888889 | 0 |
| 0.7833333333333333 | 0 |
| 0.7840277777777778 | 0 |
| 0.7847222222222222 | 0 |
| 0.7854166666666668 | 0 |
| 0.7861111111111111 | 0 |
| 0.7868055555555555 | 0 |
| 0.7875 | 0 |
| 0.7881944444444445 | 0 |
| 0.7888888888888889 | 0 |
| 0.7895833333333333 | 0 |
| 0.7902777777777777 | 0 |
| 0.7909722222222223 | 0 |
| 0.7916666666666666 | 0 |
| 0.7923611111111111 | 0 |
| 0.7930555555555556 | 0 |
| 0.7937500000000001 | 0 |
| 0.7944444444444444 | 0 |
| 0.7951388888888888 | 0 |
| 0.7958333333333334 | 0 |
| 0.7965277777777778 | 0 |
| 0.7972222222222222 | 0 |
| 0.7979166666666666 | 0 |
| 0.7986111111111112 | 0 |
| 0.7993055555555556 | 0 |
| 0.7999999999999999 | 0 |
| 0.8006944444444444 | 0 |
| 0.8013888888888889 | 0 |
| 0.8020833333333334 | 0 |
| 0.8027777777777777 | 0 |
| 0.8034722222222223 | 0 |
| 0.8041666666666667 | 0 |
| 0.8048611111111111 | 0 |
| 0.8055555555555555 | 0 |
| 0.80625 | 0 |
| 0.8069444444444445 | 0 |
| 0.8076388888888889 | 0 |
| 0.8083333333333332 | 0 |
| 0.8090277777777778 | 0 |
| 0.8097222222222222 | 0 |
| 0.8104166666666667 | 0 |
| 0.811111111111111 | 0 |
| 0.8118055555555556 | 0 |
| 0.8125 | 0 |
| 0.8131944444444444 | 0 |
| 0.813888888888889 | 0 |
| 0.8145833333333333 | 0 |
| 0.8152777777777778 | 0 |
| 0.8159722222222222 | 0 |
| 0.8166666666666668 | 0 |
| 0.8173611111111111 | 0 |
| 0.8180555555555555 | 0 |
| 0.81875 | 0 |
| 0.8194444444444445 | 0 |
| 0.8201388888888889 | 0 |
| 0.8208333333333333 | 0 |
| 0.8215277777777777 | 0 |
| 0.8222222222222223 | 0 |
| 0.8229166666666666 | 0 |
| 0.8236111111111111 | 0 |
| 0.8243055555555556 | 0 |
| 0.8250000000000001 | 0 |
| 0.8256944444444444 | 0 |
| 0.8263888888888888 | 0 |
| 0.8270833333333334 | 0 |
| 0.8277777777777778 | 0 |
| 0.8284722222222222 | 0 |
| 0.8291666666666666 | 0 |
| 0.8298611111111112 | 0 |
| 0.8305555555555556 | 0 |
| 0.8312499999999999 | 0 |
| 0.8319444444444444 | 0 |
| 0.8326388888888889 | 0 |
| 0.8333333333333334 | 0 |
| 0.8340277777777777 | 0 |
| 0.8347222222222223 | 0 |
| 0.8354166666666667 | 0 |
| 0.8361111111111111 | 0 |
| 0.8368055555555555 | 0 |
| 0.8375 | 0 |
| 0.8381944444444445 | 0 |
| 0.8388888888888889 | 0 |
| 0.8395833333333332 | 0 |
| 0.8402777777777778 | 0 |
| 0.8409722222222222 | 0 |
| 0.8416666666666667 | 0 |
| 0.842361111111111 | 0 |
| 0.8430555555555556 | 0 |
| 0.84375 | 0 |
| 0.8444444444444444 | 0 |
| 0.845138888888889 | 0 |
| 0.8458333333333333 | 0 |
| 0.8465277777777778 | 0 |
| 0.8472222222222222 | 0 |
| 0.8479166666666668 | 0 |
| 0.8486111111111111 | 0 |
| 0.8493055555555555 | 0 |
| 0.85 | 0 |
| 0.8506944444444445 | 0 |
| 0.8513888888888889 | 0 |
| 0.8520833333333333 | 0 |
| 0.8527777777777777 | 0 |
| 0.8534722222222223 | 0 |
| 0.8541666666666666 | 0 |
| 0.8548611111111111 | 0 |
| 0.8555555555555556 | 0 |
| 0.8562500000000001 | 0 |
| 0.8569444444444444 | 0 |
| 0.8576388888888888 | 0 |
| 0.8583333333333334 | 0 |
| 0.8590277777777778 | 0 |
| 0.8597222222222222 | 0 |
| 0.8604166666666666 | 0 |
| 0.8611111111111112 | 0 |
| 0.8618055555555556 | 0 |
| 0.8624999999999999 | 0 |
| 0.8631944444444444 | 0 |
| 0.8638888888888889 | 0 |
| 0.8645833333333334 | 0 |
| 0.8652777777777777 | 0 |
| 0.8659722222222223 | 0 |
| 0.8666666666666667 | 0 |
| 0.8673611111111111 | 0 |
| 0.8680555555555555 | 0 |
| 0.86875 | 0 |
| 0.8694444444444445 | 0 |
| 0.8701388888888889 | 0 |
| 0.8708333333333332 | 0 |
| 0.8715277777777778 | 0 |
| 0.8722222222222222 | 0 |
| 0.8729166666666667 | 0 |
| 0.873611111111111 | 0 |
| 0.8743055555555556 | 0 |
| 0.875 | 0 |
| 0.8756944444444444 | 0 |
| 0.876388888888889 | 0 |
| 0.8770833333333333 | 0 |
| 0.8777777777777778 | 0 |
| 0.8784722222222222 | 0 |
| 0.8791666666666668 | 0 |
| 0.8798611111111111 | 0 |
| 0.8805555555555555 | 0 |
| 0.88125 | 0 |
| 0.8819444444444445 | 0 |
| 0.8826388888888889 | 0 |
| 0.8833333333333333 | 0 |
| 0.8840277777777777 | 0 |
| 0.8847222222222223 | 0 |
| 0.8854166666666666 | 0 |
| 0.8861111111111111 | 0 |
| 0.8868055555555556 | 0 |
| 0.8875000000000001 | 0 |
| 0.8881944444444444 | 0 |
| 0.8888888888888888 | 0 |
| 0.8895833333333334 | 0 |
| 0.8902777777777778 | 0 |
| 0.8909722222222222 | 0 |
| 0.8916666666666666 | 0 |
| 0.8923611111111112 | 0 |
| 0.8930555555555556 | 0 |
| 0.8937499999999999 | 0 |
| 0.8944444444444444 | 0 |
| 0.8951388888888889 | 0 |
| 0.8958333333333334 | 0 |
| 0.8965277777777777 | 0 |
| 0.8972222222222223 | 0 |
| 0.8979166666666667 | 0 |
| 0.8986111111111111 | 0 |
| 0.8993055555555555 | 0 |
| 0.9 | 0 |
| 0.9006944444444445 | 0 |
| 0.9013888888888889 | 0 |
| 0.9020833333333332 | 0 |
| 0.9027777777777778 | 0 |
| 0.9034722222222222 | 0 |
| 0.9041666666666667 | 0 |
| 0.904861111111111 | 0 |
| 0.9055555555555556 | 0 |
| 0.90625 | 0 |
| 0.9069444444444444 | 0 |
| 0.907638888888889 | 0 |
| 0.9083333333333333 | 0 |
| 0.9090277777777778 | 0 |
| 0.9097222222222222 | 0 |
| 0.9104166666666668 | 0 |
| 0.9111111111111111 | 0 |
| 0.9118055555555555 | 0 |
| 0.9125 | 0 |
| 0.9131944444444445 | 0 |
| 0.9138888888888889 | 0 |
| 0.9145833333333333 | 0 |
| 0.9152777777777777 | 0 |
| 0.9159722222222223 | 0 |
| 0.9166666666666666 | 0 |
| 0.9173611111111111 | 0 |
| 0.9180555555555556 | 0 |
| 0.9187500000000001 | 0 |
| 0.9194444444444444 | 0 |
| 0.9201388888888888 | 0 |
| 0.9208333333333334 | 0 |
| 0.9215277777777778 | 0 |
| 0.9222222222222222 | 0 |
| 0.9229166666666666 | 0 |
| 0.9236111111111112 | 0 |
| 0.9243055555555556 | 0 |
| 0.9249999999999999 | 0 |
| 0.9256944444444444 | 0 |
| 0.9263888888888889 | 0 |
| 0.9270833333333334 | 0 |
| 0.9277777777777777 | 0 |
| 0.9284722222222223 | 0 |
| 0.9291666666666667 | 0 |
| 0.9298611111111111 | 0 |
| 0.9305555555555555 | 0 |
| 0.93125 | 0 |
| 0.9319444444444445 | 0 |
| 0.9326388888888889 | 0 |
| 0.9333333333333332 | 0 |
| 0.9340277777777778 | 0 |
| 0.9347222222222222 | 0 |
| 0.9354166666666667 | 0 |
| 0.936111111111111 | 0 |
| 0.9368055555555556 | 0 |
| 0.9375 | 0 |
| 0.9381944444444444 | 0 |
| 0.938888888888889 | 0 |
| 0.9395833333333333 | 0 |
| 0.9402777777777778 | 0 |
| 0.9409722222222222 | 0 |
| 0.9416666666666668 | 0 |
| 0.9423611111111111 | 0 |
| 0.9430555555555555 | 0 |
| 0.94375 | 0 |
| 0.9444444444444445 | 0 |
| 0.9451388888888889 | 0 |
| 0.9458333333333333 | 0 |
| 0.9465277777777777 | 0 |
| 0.9472222222222223 | 0 |
| 0.9479166666666666 | 0 |
| 0.9486111111111111 | 0 |
| 0.9493055555555556 | 0 |
| 0.9500000000000001 | 0 |
| 0.9506944444444444 | 0 |
| 0.9513888888888888 | 0 |
| 0.9520833333333334 | 0 |
| 0.9527777777777778 | 0 |
| 0.9534722222222222 | 0 |
| 0.9541666666666666 | 0 |
| 0.9548611111111112 | 0 |
| 0.9555555555555556 | 0 |
| 0.9562499999999999 | 0 |
| 0.9569444444444444 | 0 |
| 0.9576388888888889 | 0 |
| 0.9583333333333334 | 0 |
| 0.9590277777777777 | 0 |
| 0.9597222222222223 | 0 |
| 0.9604166666666667 | 0 |
| 0.9611111111111111 | 0 |
| 0.9618055555555555 | 0 |
| 0.9625 | 0 |
| 0.9631944444444445 | 0 |
| 0.9638888888888889 | 0 |
| 0.9645833333333332 | 0 |
| 0.9652777777777778 | 0 |
| 0.9659722222222222 | 0 |
| 0.9666666666666667 | 0 |
| 0.967361111111111 | 0 |
| 0.9680555555555556 | 0 |
| 0.96875 | 0 |
| 0.9694444444444444 | 0 |
| 0.970138888888889 | 0 |
| 0.9708333333333333 | 0 |
| 0.9715277777777778 | 0 |
| 0.9722222222222222 | 0 |
| 0.9729166666666668 | 0 |
| 0.9736111111111111 | 0 |
| 0.9743055555555555 | 0 |
| 0.975 | 0 |
| 0.9756944444444445 | 0 |
| 0.9763888888888889 | 0 |
| 0.9770833333333333 | 0 |
| 0.9777777777777777 | 0 |
| 0.9784722222222223 | 0 |
| 0.9791666666666666 | 0 |
| 0.9798611111111111 | 0 |
| 0.9805555555555556 | 0 |
| 0.9812500000000001 | 0 |
| 0.9819444444444444 | 0 |
| 0.9826388888888888 | 0 |
| 0.9833333333333334 | 0 |
| 0.9840277777777778 | 0 |
| 0.9847222222222222 | 0 |
| 0.9854166666666666 | 0 |
| 0.9861111111111112 | 0 |
| 0.9868055555555556 | 0 |
| 0.9874999999999999 | 0 |
| 0.9881944444444444 | 0 |
| 0.9888888888888889 | 0 |
| 0.9895833333333334 | 0 |
| 0.9902777777777777 | 0 |
| 0.9909722222222223 | 0 |
| 0.9916666666666667 | 0 |
| 0.9923611111111111 | 0 |
| 0.9930555555555555 | 0 |
| 0.99375 | 0 |
| 0.9944444444444445 | 0 |
| 0.9951388888888889 | 0 |
| 0.9958333333333332 | 0 |
| 0.9965277777777778 | 0 |
| 0.9972222222222222 | 0 |
| 0.9979166666666667 | 0 |
| 0.998611111111111 | 0 |
| 0.9993055555555556 | 0 |